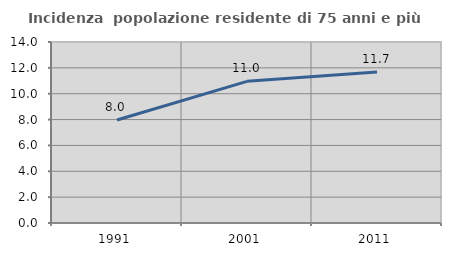
| Category | Incidenza  popolazione residente di 75 anni e più |
|---|---|
| 1991.0 | 7.963 |
| 2001.0 | 10.957 |
| 2011.0 | 11.683 |